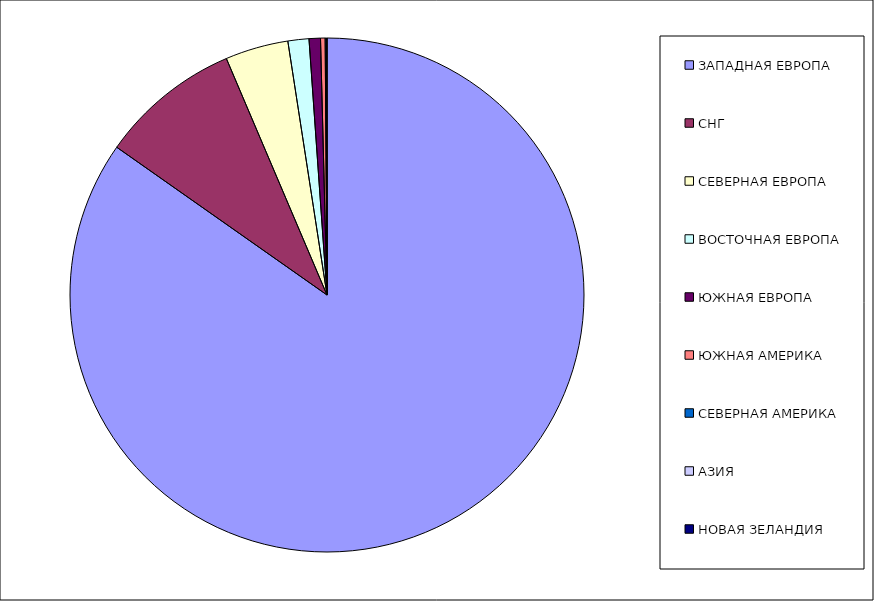
| Category | Оборот |
|---|---|
| ЗАПАДНАЯ ЕВРОПА | 0.847 |
| СНГ | 0.088 |
| СЕВЕРНАЯ ЕВРОПА | 0.04 |
| ВОСТОЧНАЯ ЕВРОПА | 0.013 |
| ЮЖНАЯ ЕВРОПА | 0.007 |
| ЮЖНАЯ АМЕРИКА | 0.003 |
| СЕВЕРНАЯ АМЕРИКА | 0.001 |
| АЗИЯ | 0 |
| НОВАЯ ЗЕЛАНДИЯ | 0 |